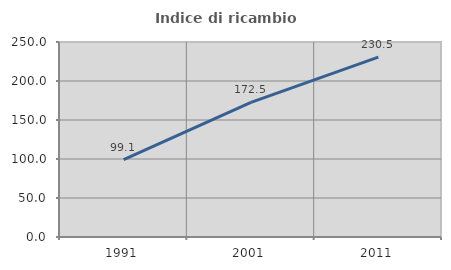
| Category | Indice di ricambio occupazionale  |
|---|---|
| 1991.0 | 99.115 |
| 2001.0 | 172.5 |
| 2011.0 | 230.508 |